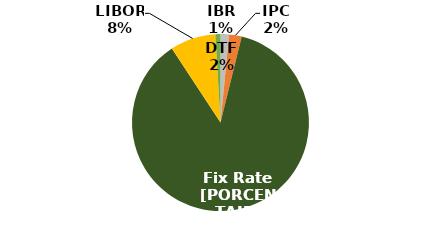
| Category | Series 0 |
|---|---|
| DTF | 0.016 |
| IPC | 0.023 |
| Tasa Fija | 0.869 |
| LIBOR | 0.083 |
| IBR | 0.009 |